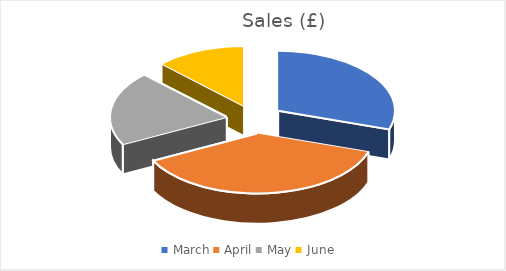
| Category |            £ |
|---|---|
| March | 60000 |
| April | 75000 |
| May | 40000 |
| June | 25000 |